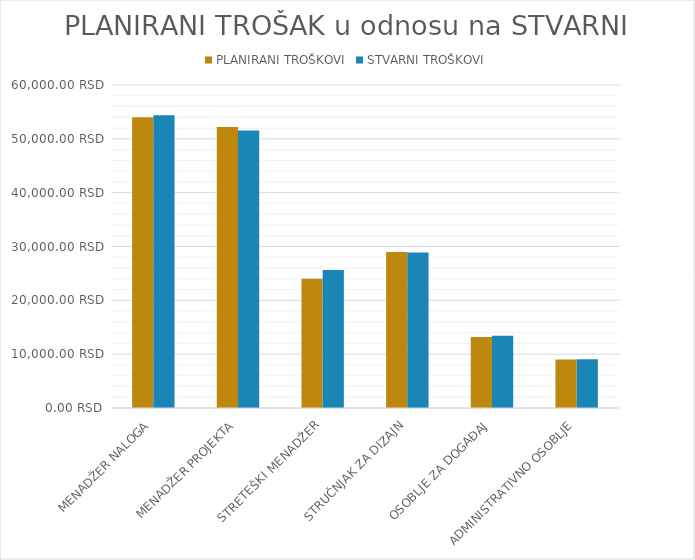
| Category | PLANIRANI TROŠKOVI | STVARNI TROŠKOVI |
|---|---|---|
| MENADŽER NALOGA | 54000 | 54360 |
| MENADŽER PROJEKTA | 52200 | 51540 |
| STRETEŠKI MENADŽER | 24000 | 25650 |
| STRUČNJAK ZA DIZAJN | 29000 | 28900 |
| OSOBLJE ZA DOGAĐAJ | 13200 | 13400 |
| ADMINISTRATIVNO OSOBLJE | 9000 | 9060 |